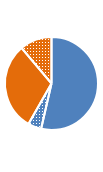
| Category | Series 0 |
|---|---|
| Full-Time | 0.536 |
| Part-Time | 0.047 |
| Full-Time | 0.306 |
| Part-Time | 0.112 |